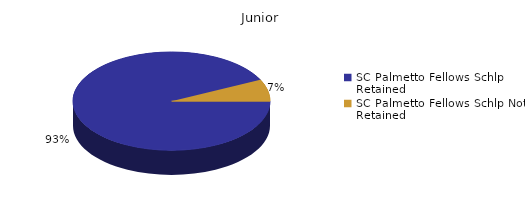
| Category | Junior |
|---|---|
| SC Palmetto Fellows Schlp Retained  | 599 |
| SC Palmetto Fellows Schlp Not Retained  | 46 |